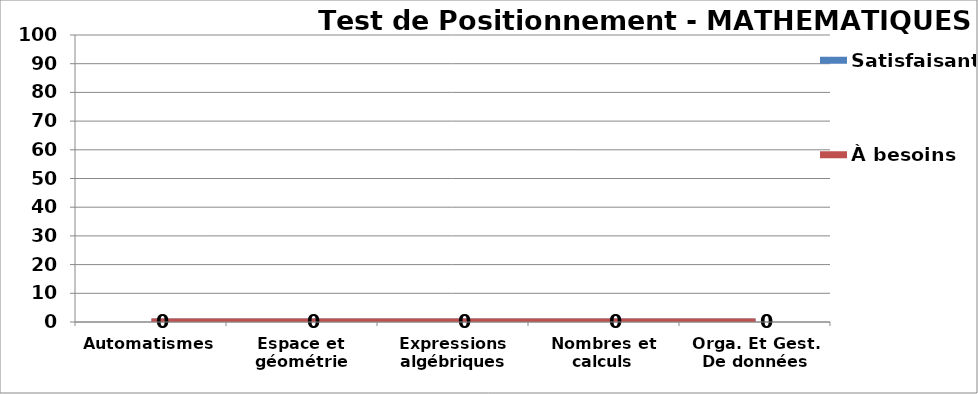
| Category | Satisfaisant | À besoins |
|---|---|---|
| Automatismes | 0 | 0 |
| Espace et géométrie | 0 | 0 |
| Expressions algébriques | 0 | 0 |
| Nombres et calculs | 0 | 0 |
| Orga. Et Gest. De données | 0 | 0 |